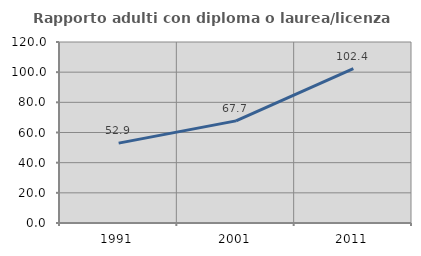
| Category | Rapporto adulti con diploma o laurea/licenza media  |
|---|---|
| 1991.0 | 52.941 |
| 2001.0 | 67.706 |
| 2011.0 | 102.362 |